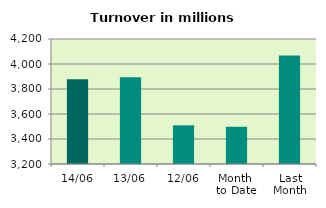
| Category | Series 0 |
|---|---|
| 14/06 | 3878.085 |
| 13/06 | 3893.818 |
| 12/06 | 3509.547 |
| Month 
to Date | 3497.829 |
| Last
Month | 4067.502 |